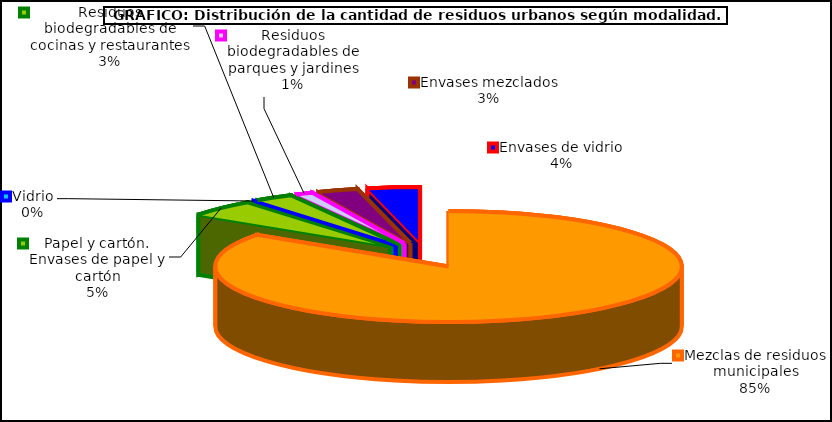
| Category | Total |
|---|---|
| Mezclas de residuos municipales | 84.666 |
| Papel y cartón. Envases de papel y cartón | 4.898 |
| Vidrio | 0.049 |
| Residuos biodegradables de cocinas y restaurantes | 2.706 |
| Residuos biodegradables de parques y jardines | 1.215 |
| Envases mezclados | 2.836 |
| Envases de vidrio | 3.63 |